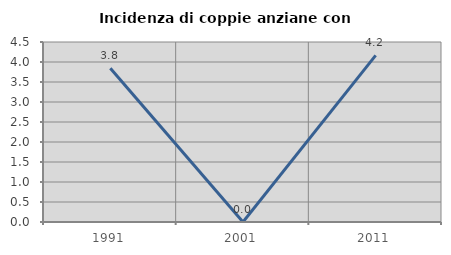
| Category | Incidenza di coppie anziane con figli |
|---|---|
| 1991.0 | 3.846 |
| 2001.0 | 0 |
| 2011.0 | 4.167 |